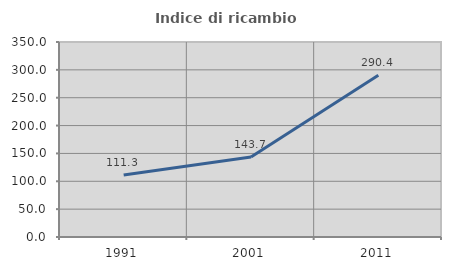
| Category | Indice di ricambio occupazionale  |
|---|---|
| 1991.0 | 111.345 |
| 2001.0 | 143.694 |
| 2011.0 | 290.37 |